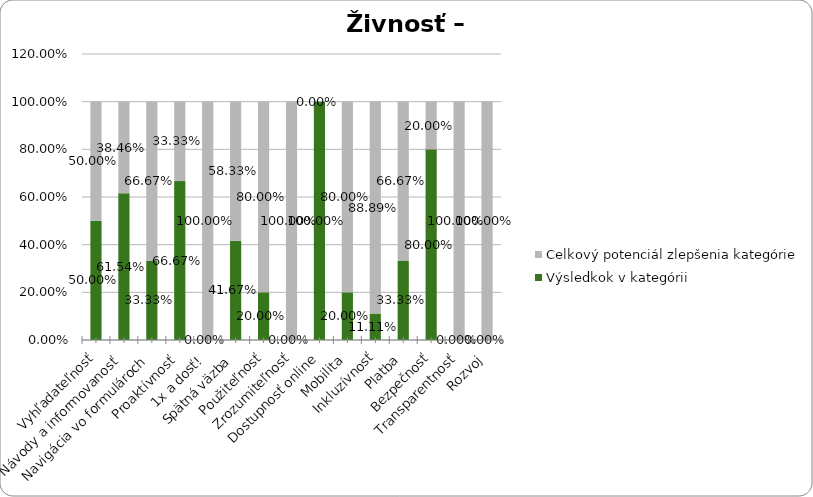
| Category | Výsledkok v kategórii | Celkový potenciál zlepšenia kategórie |
|---|---|---|
| Vyhľadateľnosť | 0.5 | 0.5 |
| Návody a informovanosť | 0.615 | 0.385 |
| Navigácia vo formulároch | 0.333 | 0.667 |
| Proaktívnosť | 0.667 | 0.333 |
| 1x a dosť! | 0 | 1 |
| Spätná väzba | 0.417 | 0.583 |
| Použiteľnosť | 0.2 | 0.8 |
| Zrozumiteľnosť | 0 | 1 |
| Dostupnosť online | 1 | 0 |
| Mobilita | 0.2 | 0.8 |
| Inkluzívnosť | 0.111 | 0.889 |
| Platba | 0.333 | 0.667 |
| Bezpečnosť | 0.8 | 0.2 |
| Transparentnosť | 0 | 1 |
| Rozvoj | 0 | 1 |